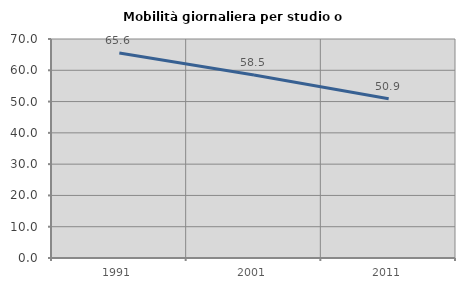
| Category | Mobilità giornaliera per studio o lavoro |
|---|---|
| 1991.0 | 65.557 |
| 2001.0 | 58.511 |
| 2011.0 | 50.916 |